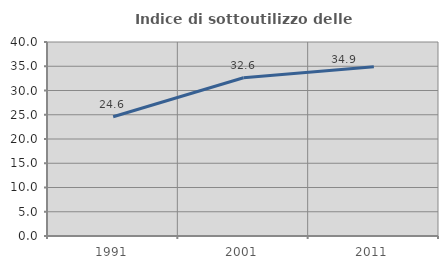
| Category | Indice di sottoutilizzo delle abitazioni  |
|---|---|
| 1991.0 | 24.589 |
| 2001.0 | 32.621 |
| 2011.0 | 34.916 |